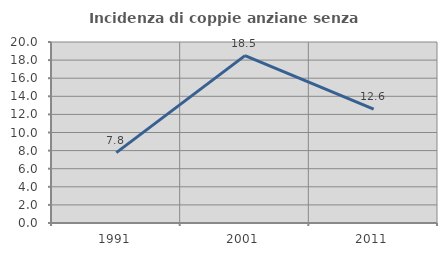
| Category | Incidenza di coppie anziane senza figli  |
|---|---|
| 1991.0 | 7.778 |
| 2001.0 | 18.497 |
| 2011.0 | 12.579 |